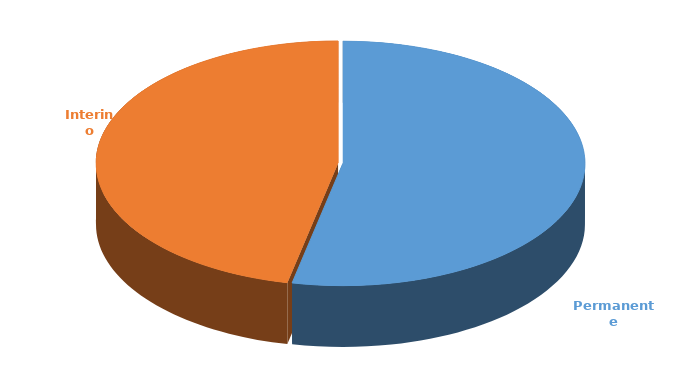
| Category | Cantidad |
|---|---|
| Permanente | 3113 |
| Interino | 2721 |